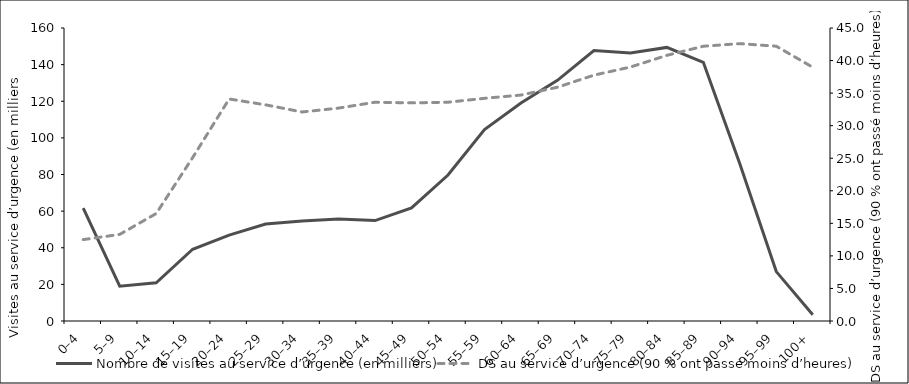
| Category | Nombre de visites au service d’urgence (en milliers) |
|---|---|
| 0 | 61.654 |
| 1 | 18.978 |
| 2 | 20.829 |
| 3 | 39.176 |
| 4 | 46.913 |
| 5 | 52.938 |
| 6 | 54.609 |
| 7 | 55.651 |
| 8 | 54.828 |
| 9 | 61.77 |
| 10 | 79.72 |
| 11 | 104.573 |
| 12 | 119.043 |
| 13 | 131.439 |
| 14 | 147.645 |
| 15 | 146.341 |
| 16 | 149.408 |
| 17 | 141.251 |
| 18 | 85.809 |
| 19 | 26.976 |
| 20 | 3.394 |